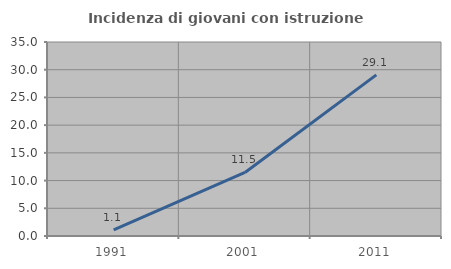
| Category | Incidenza di giovani con istruzione universitaria |
|---|---|
| 1991.0 | 1.099 |
| 2001.0 | 11.458 |
| 2011.0 | 29.07 |